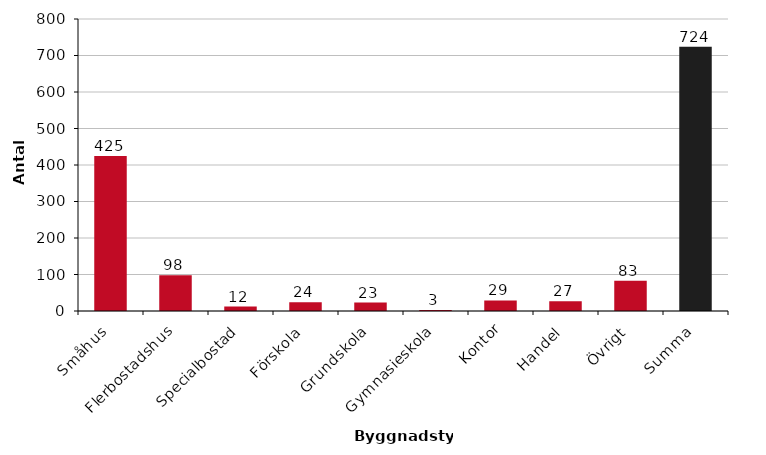
| Category | Antal klimatdeklarationer |
|---|---|
| Småhus | 425 |
| Flerbostadshus | 98 |
| Specialbostad | 12 |
| Förskola | 24 |
| Grundskola | 23 |
| Gymnasieskola | 3 |
| Kontor | 29 |
| Handel | 27 |
| Övrigt | 83 |
| Summa | 724 |